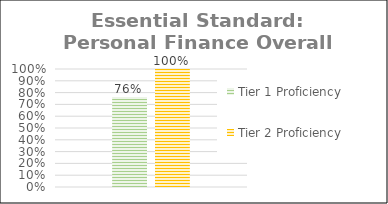
| Category | Tier 1 Proficiency | Tier 2 Proficiency |
|---|---|---|
| Total Class | 0.763 | 1 |